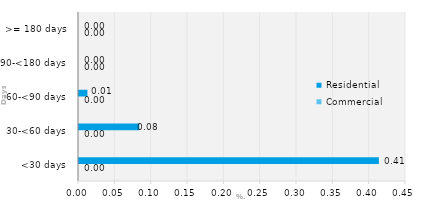
| Category | Commercial | Residential |
|---|---|---|
| <30 days | 0 | 0.413 |
| 30-<60 days | 0 | 0.083 |
| 60-<90 days | 0 | 0.012 |
| 90-<180 days | 0 | 0 |
| >= 180 days | 0 | 0 |